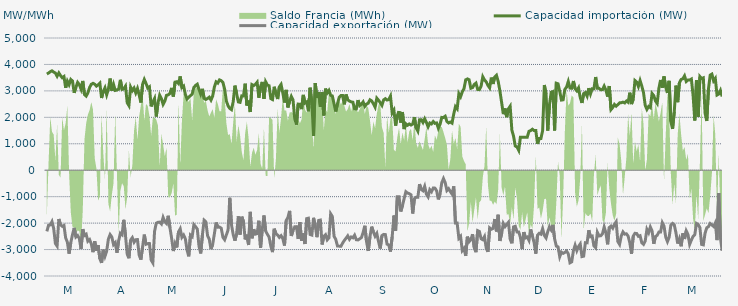
| Category | Capacidad importación (MW) | Capacidad exportación (MW) |
|---|---|---|
| 0 | 3638.208 | -2312.042 |
| 1900-01-01 | 3676.542 | -2081.625 |
| 1900-01-02 | 3724.917 | -2066.75 |
| 1900-01-03 | 3757.5 | -1941.667 |
| 1900-01-04 | 3711.333 | -2204.125 |
| 1900-01-05 | 3675.458 | -2771.042 |
| 1900-01-06 | 3554.458 | -2867.542 |
| 1900-01-07 | 3680.333 | -1844.583 |
| 1900-01-08 | 3578.458 | -2062.333 |
| 1900-01-09 | 3498.667 | -2120.125 |
| 1900-01-10 | 3542.583 | -2088.25 |
| 1900-01-11 | 3116.583 | -2558.083 |
| 1900-01-12 | 3368.333 | -2721.125 |
| 1900-01-13 | 3235.167 | -3154.375 |
| 1900-01-14 | 3431.792 | -2737.167 |
| 1900-01-15 | 3373.458 | -2436.25 |
| 1900-01-16 | 2927.625 | -2181.583 |
| 1900-01-17 | 3136.625 | -2524.417 |
| 1900-01-18 | 3321.958 | -2467.708 |
| 1900-01-19 | 3237.167 | -2582.667 |
| 1900-01-20 | 3067.667 | -2979.292 |
| 1900-01-21 | 3375.875 | -2228.75 |
| 1900-01-22 | 2860.583 | -2468.833 |
| 1900-01-23 | 2803.375 | -2421.417 |
| 1900-01-24 | 2924.833 | -2685.667 |
| 1900-01-25 | 3128.125 | -2622.333 |
| 1900-01-26 | 3249.042 | -2786 |
| 1900-01-27 | 3285.957 | -3098.435 |
| 1900-01-28 | 3251.125 | -2683.875 |
| 1900-01-29 | 3179.958 | -3042.333 |
| 1900-01-30 | 3227.792 | -2833.458 |
| 1900-01-31 | 3292.833 | -3348.958 |
| 1900-02-01 | 2730.667 | -3504.917 |
| 1900-02-02 | 2985 | -3005.417 |
| 1900-02-03 | 3117.458 | -3250.417 |
| 1900-02-04 | 2855.083 | -3052.042 |
| 1900-02-05 | 3069.458 | -2602.292 |
| 1900-02-06 | 3466.417 | -2432.792 |
| 1900-02-07 | 3007.167 | -2522.875 |
| 1900-02-08 | 3244.375 | -2811.167 |
| 1900-02-09 | 3017.708 | -2737.208 |
| 1900-02-10 | 3032.833 | -3121.625 |
| 1900-02-11 | 3065.708 | -2665.083 |
| 1900-02-12 | 3418.292 | -2382.667 |
| 1900-02-13 | 3056.792 | -2438.792 |
| 1900-02-14 | 3079.167 | -1874.583 |
| 1900-02-15 | 3179.375 | -2471.917 |
| 1900-02-16 | 2552.25 | -3173.583 |
| 1900-02-17 | 2444.667 | -3327.792 |
| 1900-02-18 | 3144.958 | -2640.625 |
| 1900-02-19 | 3010.208 | -2550.208 |
| 1900-02-20 | 3107.125 | -2722.583 |
| 1900-02-21 | 2923.625 | -2627.417 |
| 1900-02-22 | 3090.583 | -2621.917 |
| 1900-02-23 | 2846.083 | -3210.25 |
| 1900-02-24 | 2560.75 | -3379.792 |
| 1900-02-25 | 3251.25 | -2896.042 |
| 1900-02-26 | 3432.333 | -2434.75 |
| 1900-02-27 | 3283.375 | -2799.542 |
| 1900-02-28 | 3108.792 | -2777.042 |
| 1900-02-28 | 3154.917 | -2772.25 |
| 1900-03-01 | 2413.25 | -3395.792 |
| 1900-03-02 | 2576 | -3503 |
| 1900-03-03 | 2711.917 | -2310.333 |
| 1900-03-04 | 2031.25 | -2002.083 |
| 1900-03-05 | 2544.667 | -1970.833 |
| 1900-03-06 | 2838.208 | -1962.5 |
| 1900-03-07 | 2706.708 | -2031.25 |
| 1900-03-08 | 2490.375 | -1785.417 |
| 1900-03-09 | 2612.792 | -1947.333 |
| 1900-03-10 | 2833 | -2014.333 |
| 1900-03-11 | 2851.583 | -1722.917 |
| 1900-03-12 | 2901.75 | -2171.25 |
| 1900-03-13 | 3113.667 | -2582.042 |
| 1900-03-14 | 2787.083 | -3055.958 |
| 1900-03-15 | 3331.625 | -2767.125 |
| 1900-03-16 | 3347 | -2920.625 |
| 1900-03-17 | 3277.833 | -2334.375 |
| 1900-03-18 | 3547.333 | -2216.875 |
| 1900-03-19 | 3127.583 | -2536.667 |
| 1900-03-20 | 3182.75 | -2450.958 |
| 1900-03-21 | 2868.792 | -2589.917 |
| 1900-03-22 | 2696.25 | -3016.542 |
| 1900-03-23 | 2758.458 | -3256.458 |
| 1900-03-24 | 2820.083 | -2452.083 |
| 1900-03-25 | 2874.792 | -2511.083 |
| 1900-03-26 | 3131.542 | -2059.125 |
| 1900-03-27 | 3205.375 | -2136.25 |
| 1900-03-28 | 3253.375 | -2224.125 |
| 1900-03-29 | 3057.042 | -2870.958 |
| 1900-03-30 | 2876.042 | -3146.333 |
| 1900-03-31 | 3076.708 | -2437.5 |
| 1900-04-01 | 2714.417 | -1890.667 |
| 1900-04-02 | 2675.25 | -1952.042 |
| 1900-04-03 | 2712.625 | -2473.333 |
| 1900-04-04 | 2762.542 | -2608.917 |
| 1900-04-05 | 2652 | -2984.583 |
| 1900-04-06 | 2806.792 | -2803.333 |
| 1900-04-07 | 3151.167 | -2401.458 |
| 1900-04-08 | 3341.792 | -1976.417 |
| 1900-04-09 | 3295.083 | -2154.25 |
| 1900-04-10 | 3415.542 | -2148.458 |
| 1900-04-11 | 3386.458 | -2191.625 |
| 1900-04-12 | 3315.833 | -2538.333 |
| 1900-04-13 | 3059.75 | -2627.417 |
| 1900-04-14 | 2619.042 | -2445.958 |
| 1900-04-15 | 2434.542 | -2258.708 |
| 1900-04-16 | 2336.958 | -1043.75 |
| 1900-04-17 | 2291.5 | -2066.667 |
| 1900-04-18 | 2591.375 | -2432.417 |
| 1900-04-19 | 3198.167 | -2666.208 |
| 1900-04-20 | 2894.833 | -2404.875 |
| 1900-04-21 | 2582.208 | -1743.542 |
| 1900-04-22 | 2566.333 | -2434.875 |
| 1900-04-23 | 2811.458 | -1757.708 |
| 1900-04-24 | 2808 | -1938.167 |
| 1900-04-25 | 3272.083 | -2618.542 |
| 1900-04-26 | 2447.208 | -2437.333 |
| 1900-04-27 | 2633.208 | -2826.667 |
| 1900-04-28 | 2202.083 | -1575 |
| 1900-04-29 | 3237.583 | -2574.625 |
| 1900-04-30 | 3201.042 | -2230.542 |
| 1900-05-01 | 3248.625 | -2416.417 |
| 1900-05-02 | 3327.583 | -2395.083 |
| 1900-05-03 | 2740.958 | -1910.417 |
| 1900-05-04 | 3160.083 | -2937.917 |
| 1900-05-05 | 3339 | -2237.833 |
| 1900-05-06 | 2697.208 | -1712.5 |
| 1900-05-07 | 3342.917 | -2305.083 |
| 1900-05-08 | 3218 | -2421.583 |
| 1900-05-09 | 3194.333 | -2530.333 |
| 1900-05-10 | 2706.458 | -2869.083 |
| 1900-05-11 | 2673 | -3096.5 |
| 1900-05-12 | 3156.5 | -2212.083 |
| 1900-05-13 | 2884.958 | -2401.708 |
| 1900-05-14 | 2692.292 | -2450.833 |
| 1900-05-15 | 3152.125 | -2539.5 |
| 1900-05-16 | 3244.042 | -2473.208 |
| 1900-05-17 | 2930.458 | -2581.292 |
| 1900-05-18 | 2559.833 | -2848.708 |
| 1900-05-19 | 3037.583 | -1901.417 |
| 1900-05-20 | 2375 | -1787.5 |
| 1900-05-21 | 2608.75 | -1537.5 |
| 1900-05-22 | 2790.667 | -2487.458 |
| 1900-05-23 | 2656.542 | -2277.167 |
| 1900-05-24 | 1950.833 | -2138.208 |
| 1900-05-25 | 1725 | -2133.333 |
| 1900-05-26 | 2500 | -2600 |
| 1900-05-27 | 2493.5 | -1964.583 |
| 1900-05-28 | 2311.125 | -2662.542 |
| 1900-05-29 | 2848.5 | -2386.333 |
| 1900-05-30 | 2541.5 | -2790.625 |
| 1900-05-31 | 2586.083 | -1829.542 |
| 1900-06-01 | 2229.167 | -1813.75 |
| 1900-06-02 | 3118.458 | -2430.875 |
| 1900-06-03 | 2560.5 | -2453.333 |
| 1900-06-04 | 1300 | -1800 |
| 1900-06-05 | 3293.208 | -2107.333 |
| 1900-06-06 | 2732.333 | -2531.667 |
| 1900-06-07 | 2958.208 | -1899.667 |
| 1900-06-08 | 2400 | -1885.417 |
| 1900-06-09 | 2949.792 | -2809.042 |
| 1900-06-10 | 2072.292 | -2500 |
| 1900-06-11 | 3083.958 | -2440.167 |
| 1900-06-12 | 2921.208 | -2632.667 |
| 1900-06-13 | 3017.667 | -2556.542 |
| 1900-06-14 | 2833.833 | -1646.083 |
| 1900-06-15 | 2807.833 | -1750 |
| 1900-06-16 | 2510.417 | -2496.792 |
| 1900-06-17 | 2220.833 | -2618.625 |
| 1900-06-18 | 2512.5 | -2867.042 |
| 1900-06-19 | 2756.375 | -2870.75 |
| 1900-06-20 | 2821.542 | -2876.667 |
| 1900-06-21 | 2821.833 | -2755.625 |
| 1900-06-22 | 2490.292 | -2656.833 |
| 1900-06-23 | 2862.667 | -2571.458 |
| 1900-06-24 | 2663.042 | -2482.25 |
| 1900-06-25 | 2613.625 | -2612.792 |
| 1900-06-26 | 2585.667 | -2523.458 |
| 1900-06-27 | 2571.292 | -2556.167 |
| 1900-06-28 | 2320.458 | -2456.542 |
| 1900-06-29 | 2316.542 | -2627.667 |
| 1900-06-30 | 2652.5 | -2635.708 |
| 1900-07-01 | 2442.625 | -2594.208 |
| 1900-07-02 | 2493.458 | -2546.125 |
| 1900-07-03 | 2582.917 | -2351.208 |
| 1900-07-04 | 2416.667 | -2100 |
| 1900-07-05 | 2504.5 | -2703.167 |
| 1900-07-06 | 2536.625 | -3052.25 |
| 1900-07-07 | 2662.208 | -2510.833 |
| 1900-07-08 | 2620.667 | -2134.75 |
| 1900-07-09 | 2511.833 | -2330.583 |
| 1900-07-10 | 2387.333 | -2494.25 |
| 1900-07-11 | 2724.583 | -2389 |
| 1900-07-12 | 2648.667 | -2691.542 |
| 1900-07-13 | 2557.292 | -2961.542 |
| 1900-07-14 | 2454.083 | -2472.25 |
| 1900-07-15 | 2661.417 | -2427.292 |
| 1900-07-16 | 2704.833 | -2434.167 |
| 1900-07-17 | 2653.75 | -2795.833 |
| 1900-07-18 | 2673.75 | -2822.875 |
| 1900-07-19 | 2800.917 | -3075.208 |
| 1900-07-20 | 2164.417 | -2510.625 |
| 1900-07-21 | 2270.833 | -1713.542 |
| 1900-07-22 | 1687.5 | -2291.667 |
| 1900-07-23 | 2066.667 | -1000 |
| 1900-07-24 | 2233.333 | -1000 |
| 1900-07-25 | 1804.167 | -1561.333 |
| 1900-07-26 | 2201.833 | -1341.667 |
| 1900-07-27 | 1556.25 | -1070.833 |
| 1900-07-28 | 1756.25 | -812.5 |
| 1900-07-29 | 1700 | -864.583 |
| 1900-07-30 | 1750 | -885.417 |
| 1900-07-31 | 1708.333 | -929.167 |
| 1900-08-01 | 1743.75 | -1636.25 |
| 1900-08-02 | 2008.083 | -1077.083 |
| 1900-08-03 | 1602.083 | -1020.833 |
| 1900-08-04 | 1479.167 | -1022.917 |
| 1900-08-05 | 1910.417 | -525 |
| 1900-08-06 | 1912.5 | -727.083 |
| 1900-08-07 | 1804.167 | -775 |
| 1900-08-08 | 1945.833 | -608.333 |
| 1900-08-09 | 1808.333 | -904.167 |
| 1900-08-10 | 1641.667 | -1006.25 |
| 1900-08-11 | 1785.417 | -735.417 |
| 1900-08-12 | 1752.083 | -812.5 |
| 1900-08-13 | 1841.667 | -675 |
| 1900-08-14 | 1772.917 | -677.083 |
| 1900-08-15 | 1788 | -777.083 |
| 1900-08-16 | 1587.5 | -1104.167 |
| 1900-08-17 | 1737.5 | -900 |
| 1900-08-18 | 1997.917 | -475 |
| 1900-08-19 | 1995.833 | -316.667 |
| 1900-08-20 | 2041.667 | -468.75 |
| 1900-08-21 | 1843.75 | -766.667 |
| 1900-08-22 | 1787.5 | -695.833 |
| 1900-08-23 | 1820.833 | -808.333 |
| 1900-08-24 | 1781.25 | -900 |
| 1900-08-25 | 2126.667 | -608.333 |
| 1900-08-26 | 2404.417 | -2000 |
| 1900-08-27 | 2323.167 | -2000 |
| 1900-08-28 | 2893.583 | -2571.5 |
| 1900-08-29 | 2778.083 | -2500.25 |
| 1900-08-30 | 2965.5 | -3038.667 |
| 1900-08-31 | 3083.64 | -2955.48 |
| 1900-09-01 | 3418.208 | -3238.958 |
| 1900-09-02 | 3452.875 | -2513.333 |
| 1900-09-03 | 3420.292 | -2703.208 |
| 1900-09-04 | 3100.083 | -2630.333 |
| 1900-09-05 | 3123.375 | -2422.458 |
| 1900-09-06 | 3242.792 | -2928.833 |
| 1900-09-07 | 3294.958 | -3098.417 |
| 1900-09-08 | 3054.042 | -2285.333 |
| 1900-09-09 | 3047.542 | -2315.25 |
| 1900-09-10 | 3179.458 | -2592.333 |
| 1900-09-11 | 3533.833 | -2627.792 |
| 1900-09-12 | 3414 | -2509.75 |
| 1900-09-13 | 3340.25 | -2944.208 |
| 1900-09-14 | 3208.208 | -3084.875 |
| 1900-09-15 | 3116.333 | -2180.292 |
| 1900-09-16 | 3502.875 | -2231.333 |
| 1900-09-17 | 3262.542 | -2201.667 |
| 1900-09-18 | 3524.167 | -1845.708 |
| 1900-09-19 | 3589.042 | -2314 |
| 1900-09-20 | 3358.375 | -1684.042 |
| 1900-09-21 | 3002 | -2672.375 |
| 1900-09-22 | 2567.583 | -2409.375 |
| 1900-09-23 | 2121 | -2013.417 |
| 1900-09-24 | 2334.5 | -2132.333 |
| 1900-09-25 | 2006.833 | -2047.042 |
| 1900-09-26 | 2325 | -1968.542 |
| 1900-09-27 | 2420.75 | -2611.292 |
| 1900-09-28 | 1517.25 | -2763 |
| 1900-09-29 | 1283.917 | -2141.667 |
| 1900-09-30 | 916.417 | -2120.833 |
| 1900-10-01 | 879.167 | -2332.417 |
| 1900-10-02 | 750 | -2334.958 |
| 1900-10-03 | 1250 | -2536 |
| 1900-10-04 | 1250 | -2982 |
| 1900-10-05 | 1250 | -2338.583 |
| 1900-10-06 | 1250 | -2558.333 |
| 1900-10-07 | 1250 | -2526.375 |
| 1900-10-08 | 1470.833 | -2652.25 |
| 1900-10-09 | 1500 | -2239.292 |
| 1900-10-10 | 1550 | -2486.75 |
| 1900-10-11 | 1500 | -2733.5 |
| 1900-10-12 | 1500 | -3155.125 |
| 1900-10-13 | 1000 | -2458.542 |
| 1900-10-14 | 1200 | -2385.25 |
| 1900-10-15 | 1200 | -2419 |
| 1900-10-16 | 1500 | -2208.75 |
| 1900-10-17 | 3221.708 | -2468.625 |
| 1900-10-18 | 2881.375 | -2561.25 |
| 1900-10-19 | 1500 | -2320.833 |
| 1900-10-20 | 2479.75 | -2136.875 |
| 1900-10-21 | 2947.875 | -2253.917 |
| 1900-10-22 | 2974.833 | -2068.75 |
| 1900-10-23 | 1500 | -2595.083 |
| 1900-10-24 | 3289.208 | -2867.583 |
| 1900-10-25 | 3267.875 | -2898.625 |
| 1900-10-26 | 2979.083 | -3270.083 |
| 1900-10-27 | 2652.375 | -3097.333 |
| 1900-10-28 | 2663.208 | -3144.542 |
| 1900-10-29 | 3058.292 | -3107.917 |
| 1900-10-30 | 3141.958 | -3054.292 |
| 1900-10-31 | 3354.667 | -3163.833 |
| 1900-11-01 | 3106.083 | -3500.875 |
| 1900-11-02 | 3099.042 | -3464.417 |
| 1900-11-03 | 3374.208 | -3046.25 |
| 1900-11-04 | 3081.083 | -2836.417 |
| 1900-11-05 | 3002 | -3040.417 |
| 1900-11-06 | 3113.875 | -2884.417 |
| 1900-11-07 | 2746.792 | -2789.333 |
| 1900-11-08 | 2544 | -3266.167 |
| 1900-11-09 | 2896.458 | -3250.667 |
| 1900-11-10 | 2937 | -2740.375 |
| 1900-11-11 | 2803.458 | -2745 |
| 1900-11-12 | 3104.125 | -2267.833 |
| 1900-11-13 | 2884.333 | -2514.583 |
| 1900-11-14 | 3081.042 | -2493.458 |
| 1900-11-15 | 3079.083 | -2866 |
| 1900-11-16 | 3524.292 | -2932.083 |
| 1900-11-17 | 3096.5 | -2347.083 |
| 1900-11-18 | 3096.5 | -2484.875 |
| 1900-11-19 | 3044.417 | -2478.583 |
| 1900-11-20 | 3048.167 | -2403.5 |
| 1900-11-21 | 3181.083 | -2147.542 |
| 1900-11-22 | 3030.708 | -2365.833 |
| 1900-11-23 | 2784.5 | -2801.333 |
| 1900-11-24 | 3182.417 | -2165.083 |
| 1900-11-25 | 2292.583 | -2110.5 |
| 1900-11-26 | 2370.25 | -2192.75 |
| 1900-11-27 | 2487.208 | -2051.417 |
| 1900-11-28 | 2421.292 | -1952.083 |
| 1900-11-29 | 2482.917 | -2699.375 |
| 1900-11-30 | 2548.458 | -2805.375 |
| 1900-12-01 | 2554.458 | -2484.042 |
| 1900-12-02 | 2574.083 | -2331.417 |
| 1900-12-03 | 2544.458 | -2417.833 |
| 1900-12-04 | 2615.833 | -2403.25 |
| 1900-12-05 | 2568.917 | -2488.625 |
| 1900-12-06 | 2932.208 | -2748.875 |
| 1900-12-07 | 2500.875 | -3160.125 |
| 1900-12-08 | 2689.458 | -2491.667 |
| 1900-12-09 | 3392.292 | -2386.5 |
| 1900-12-10 | 3335.083 | -2392.75 |
| 1900-12-11 | 3167.5 | -2500.5 |
| 1900-12-12 | 3390.625 | -2475.917 |
| 1900-12-13 | 3180.958 | -2741.75 |
| 1900-12-14 | 2936.5 | -2801.625 |
| 1900-12-15 | 2452.792 | -2674.667 |
| 1900-12-16 | 2300.208 | -2235.25 |
| 1900-12-17 | 2411.792 | -2365.167 |
| 1900-12-18 | 2366.75 | -2147.917 |
| 1900-12-19 | 2902.042 | -2292.875 |
| 1900-12-20 | 2822.25 | -2784.375 |
| 1900-12-21 | 2619.333 | -2505.792 |
| 1900-12-22 | 2523.292 | -2462.542 |
| 1900-12-23 | 3101.75 | -2337.5 |
| 1900-12-24 | 3414.042 | -2335.5 |
| 1900-12-25 | 3119.417 | -1987.458 |
| 1900-12-26 | 3547.333 | -2114.583 |
| 1900-12-27 | 3135.708 | -2530.042 |
| 1900-12-28 | 2921.125 | -2699.333 |
| 1900-12-29 | 3380.917 | -2535.75 |
| 1900-12-30 | 1842.042 | -2078.542 |
| 1900-12-31 | 1566.833 | -2010.417 |
| 1901-01-01 | 2214.542 | -2066.667 |
| 1901-01-02 | 3198.583 | -2370 |
| 1901-01-03 | 2574 | -2772.958 |
| 1901-01-04 | 3310.583 | -2592.083 |
| 1901-01-05 | 3430.75 | -2875.542 |
| 1901-01-06 | 3458.333 | -2387.75 |
| 1901-01-07 | 3568.125 | -2599.208 |
| 1901-01-08 | 3355.708 | -2294.333 |
| 1901-01-09 | 3414.333 | -2427 |
| 1901-01-10 | 3410.542 | -2802.125 |
| 1901-01-11 | 3447.375 | -2640.958 |
| 1901-01-12 | 2831.208 | -2506.667 |
| 1901-01-13 | 1881.583 | -2434.25 |
| 1901-01-14 | 3406.708 | -2011.583 |
| 1901-01-15 | 2022.5 | -2050 |
| 1901-01-16 | 3540.875 | -2176.417 |
| 1901-01-17 | 3466.542 | -2807.167 |
| 1901-01-18 | 3493.375 | -2823.167 |
| 1901-01-19 | 2166.833 | -2382.125 |
| 1901-01-20 | 1859.958 | -2177.167 |
| 1901-01-21 | 3077.875 | -2132.833 |
| 1901-01-22 | 3595.75 | -2015.417 |
| 1901-01-23 | 3634.375 | -2069.417 |
| 1901-01-24 | 3379.833 | -2125 |
| 1901-01-25 | 3470.304 | -1991.957 |
| 1901-01-26 | 2844 | -2641.708 |
| 1901-01-27 | 2880.625 | -862.5 |
| 1901-01-28 | 3017.208 | -2558.208 |
| 1901-01-29 | 2787.708 | -3047.042 |